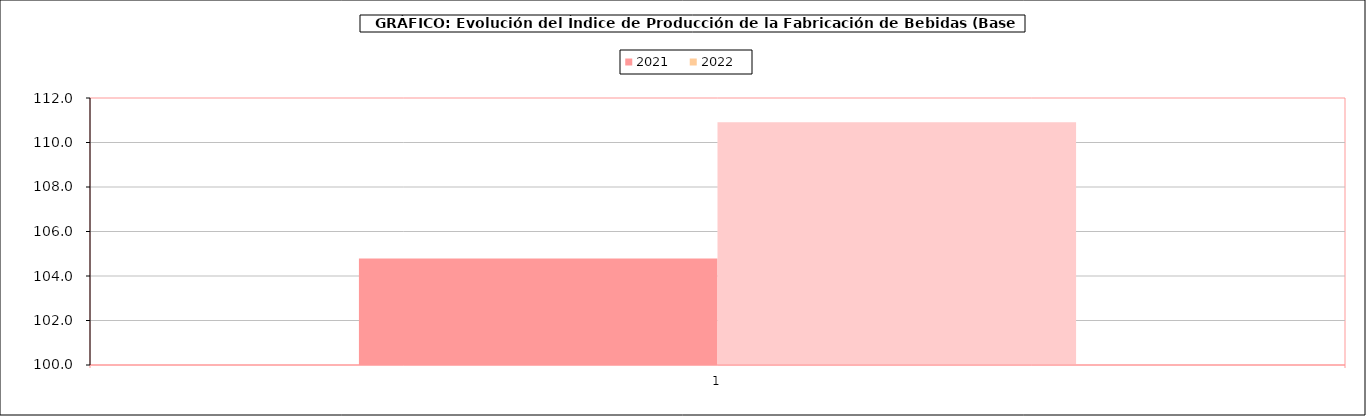
| Category | 2021 | 2022 |
|---|---|---|
| 0 | 104.791 | 110.912 |